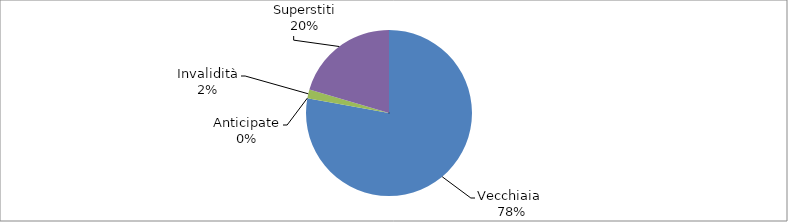
| Category | Series 0 |
|---|---|
| Vecchiaia  | 32260 |
| Anticipate | 0 |
| Invalidità | 705 |
| Superstiti | 8466 |